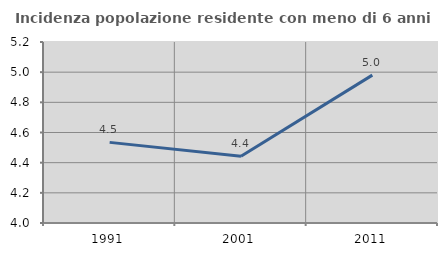
| Category | Incidenza popolazione residente con meno di 6 anni |
|---|---|
| 1991.0 | 4.534 |
| 2001.0 | 4.442 |
| 2011.0 | 4.98 |